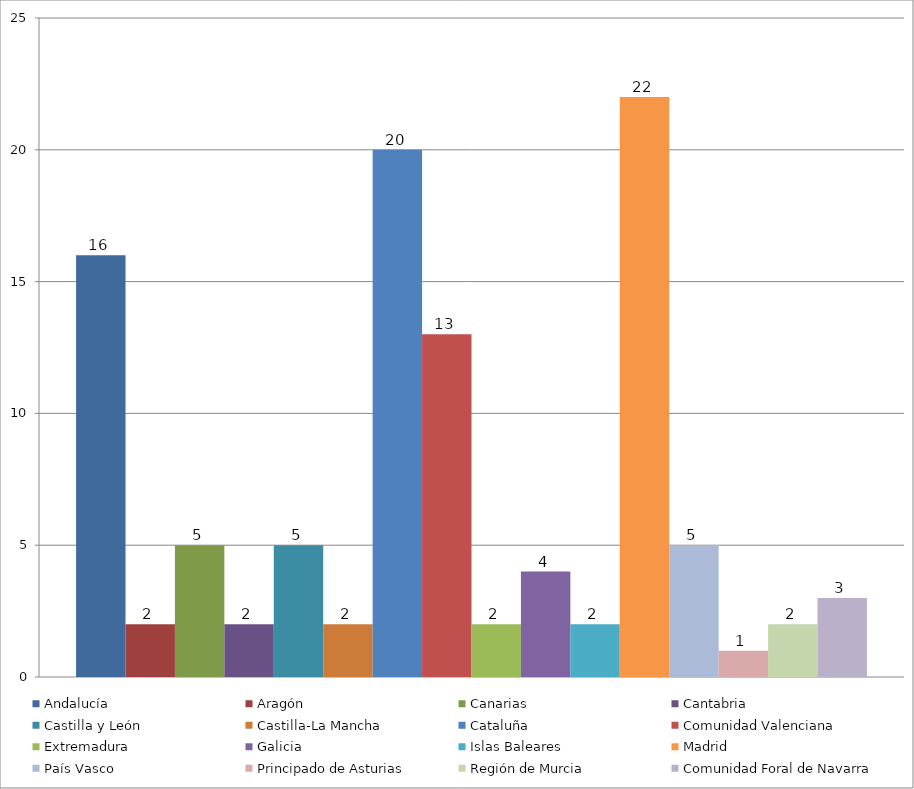
| Category | Andalucía | Aragón | Canarias | Cantabria | Castilla y León | Castilla-La Mancha | Cataluña | Comunidad Valenciana | Extremadura | Galicia | Islas Baleares | Madrid | País Vasco | Principado de Asturias | Región de Murcia | Comunidad Foral de Navarra |
|---|---|---|---|---|---|---|---|---|---|---|---|---|---|---|---|---|
| Total | 16 | 2 | 5 | 2 | 5 | 2 | 20 | 13 | 2 | 4 | 2 | 22 | 5 | 1 | 2 | 3 |